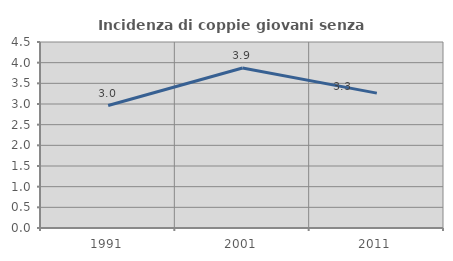
| Category | Incidenza di coppie giovani senza figli |
|---|---|
| 1991.0 | 2.964 |
| 2001.0 | 3.869 |
| 2011.0 | 3.263 |